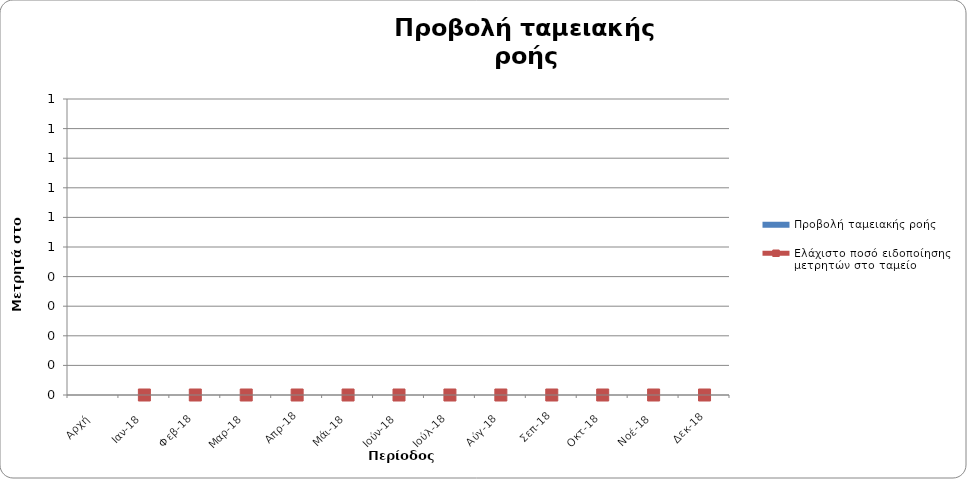
| Category | Προβολή ταμειακής ροής |
|---|---|
| Αρχή | 0 |
| Ιαν-18 | 0 |
| Φεβ-18 | 0 |
| Μαρ-18 | 0 |
| Απρ-18 | 0 |
| Μάι-18 | 0 |
| Ιούν-18 | 0 |
| Ιούλ-18 | 0 |
| Αύγ-18 | 0 |
| Σεπ-18 | 0 |
| Οκτ-18 | 0 |
| Νοέ-18 | 0 |
| Δεκ-18 | 0 |